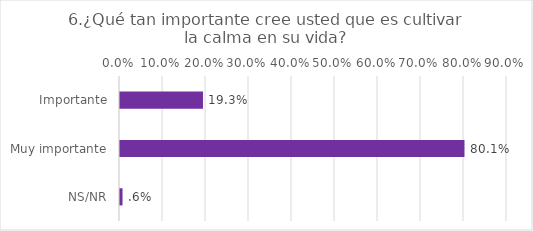
| Category | Series 0 |
|---|---|
| Importante | 0.193 |
| Muy importante | 0.801 |
| NS/NR | 0.006 |